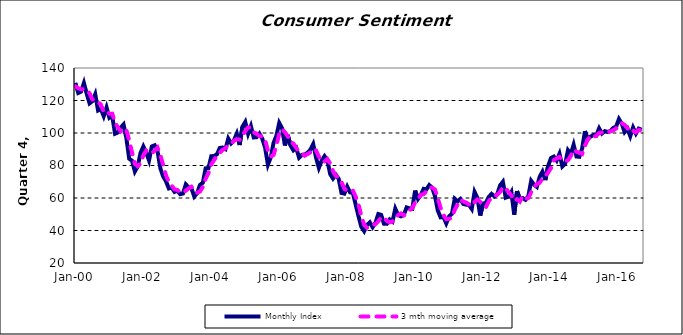
| Category | Monthly Index | 3 mth moving average |
|---|---|---|
| 2000-01-01 | 130.854 | 128.727 |
| 2000-02-01 | 124.642 | 127.553 |
| 2000-03-01 | 125.471 | 126.989 |
| 2000-04-01 | 130.785 | 126.966 |
| 2000-05-01 | 124.1 | 126.785 |
| 2000-06-01 | 118.243 | 124.376 |
| 2000-07-01 | 119.633 | 120.659 |
| 2000-08-01 | 123.854 | 120.577 |
| 2000-09-01 | 113.849 | 119.112 |
| 2000-10-01 | 114.76 | 117.487 |
| 2000-11-01 | 110.348 | 112.986 |
| 2000-12-01 | 115.74 | 113.616 |
| 2001-01-01 | 109.394 | 111.828 |
| 2001-02-01 | 110.585 | 111.907 |
| 2001-03-01 | 99.542 | 106.507 |
| 2001-04-01 | 100.32 | 103.483 |
| 2001-05-01 | 103.365 | 101.076 |
| 2001-06-01 | 105.264 | 102.983 |
| 2001-07-01 | 96.893 | 101.841 |
| 2001-08-01 | 84.156 | 95.438 |
| 2001-09-01 | 82.945 | 87.998 |
| 2001-10-01 | 76.305 | 81.135 |
| 2001-11-01 | 79.442 | 79.564 |
| 2001-12-01 | 87.701 | 81.149 |
| 2002-01-01 | 91.715 | 86.286 |
| 2002-02-01 | 87.952 | 89.123 |
| 2002-03-01 | 83.1 | 87.589 |
| 2002-04-01 | 91.732 | 87.594 |
| 2002-05-01 | 92.449 | 89.094 |
| 2002-06-01 | 88.968 | 91.05 |
| 2002-07-01 | 78.318 | 86.578 |
| 2002-08-01 | 73.284 | 80.19 |
| 2002-09-01 | 70.275 | 73.959 |
| 2002-10-01 | 65.899 | 69.819 |
| 2002-11-01 | 66.462 | 67.545 |
| 2002-12-01 | 63.754 | 65.372 |
| 2003-01-01 | 64.538 | 64.918 |
| 2003-02-01 | 62.348 | 63.547 |
| 2003-03-01 | 62.77 | 63.219 |
| 2003-04-01 | 68.406 | 64.508 |
| 2003-05-01 | 66.543 | 65.906 |
| 2003-06-01 | 65.817 | 66.922 |
| 2003-07-01 | 60.882 | 64.414 |
| 2003-08-01 | 63.048 | 63.249 |
| 2003-09-01 | 68.012 | 63.981 |
| 2003-10-01 | 69.377 | 66.812 |
| 2003-11-01 | 78.239 | 71.876 |
| 2003-12-01 | 78.337 | 75.317 |
| 2004-01-01 | 85.719 | 80.765 |
| 2004-02-01 | 85.823 | 83.293 |
| 2004-03-01 | 86.901 | 86.148 |
| 2004-04-01 | 90.768 | 87.83 |
| 2004-05-01 | 91.067 | 89.578 |
| 2004-06-01 | 90.101 | 90.645 |
| 2004-07-01 | 96.587 | 92.585 |
| 2004-08-01 | 93.595 | 93.427 |
| 2004-09-01 | 95.471 | 95.217 |
| 2004-10-01 | 99.608 | 96.224 |
| 2004-11-01 | 92.605 | 95.895 |
| 2004-12-01 | 103.858 | 98.69 |
| 2005-01-01 | 106.787 | 101.084 |
| 2005-02-01 | 99.524 | 103.39 |
| 2005-03-01 | 104.248 | 103.52 |
| 2005-04-01 | 97.268 | 100.347 |
| 2005-05-01 | 97.391 | 99.636 |
| 2005-06-01 | 99.616 | 98.092 |
| 2005-07-01 | 96.532 | 97.846 |
| 2005-08-01 | 90.996 | 95.714 |
| 2005-09-01 | 80.504 | 89.344 |
| 2005-10-01 | 84.96 | 85.487 |
| 2005-11-01 | 93.966 | 86.477 |
| 2005-12-01 | 98.245 | 92.39 |
| 2006-01-01 | 106.172 | 99.461 |
| 2006-02-01 | 102.898 | 102.438 |
| 2006-03-01 | 92.327 | 100.465 |
| 2006-04-01 | 98.827 | 98.017 |
| 2006-05-01 | 92.311 | 94.488 |
| 2006-06-01 | 89.35 | 93.496 |
| 2006-07-01 | 90.854 | 90.838 |
| 2006-08-01 | 84.831 | 88.345 |
| 2006-09-01 | 86.547 | 87.41 |
| 2006-10-01 | 86.718 | 86.032 |
| 2006-11-01 | 87.859 | 87.041 |
| 2006-12-01 | 89.761 | 88.113 |
| 2007-01-01 | 93.17 | 90.263 |
| 2007-02-01 | 84.86 | 89.264 |
| 2007-03-01 | 78.529 | 85.52 |
| 2007-04-01 | 82.999 | 82.129 |
| 2007-05-01 | 85.732 | 82.42 |
| 2007-06-01 | 83.166 | 83.966 |
| 2007-07-01 | 74.696 | 81.198 |
| 2007-08-01 | 71.97 | 76.611 |
| 2007-09-01 | 74.26 | 73.642 |
| 2007-10-01 | 71.848 | 72.693 |
| 2007-11-01 | 63.082 | 69.73 |
| 2007-12-01 | 62.686 | 65.872 |
| 2008-01-01 | 67.013 | 64.261 |
| 2008-02-01 | 63.502 | 64.4 |
| 2008-03-01 | 63.253 | 64.589 |
| 2008-04-01 | 55.965 | 60.907 |
| 2008-05-01 | 48.813 | 56.011 |
| 2008-06-01 | 42.23 | 49.003 |
| 2008-07-01 | 39.593 | 43.545 |
| 2008-08-01 | 43.372 | 41.731 |
| 2008-09-01 | 45.022 | 42.662 |
| 2008-10-01 | 42.03 | 43.474 |
| 2008-11-01 | 44.769 | 43.94 |
| 2008-12-01 | 50.15 | 45.65 |
| 2009-01-01 | 49.617 | 48.179 |
| 2009-02-01 | 44.201 | 47.99 |
| 2009-03-01 | 44.105 | 45.975 |
| 2009-04-01 | 46.773 | 45.026 |
| 2009-05-01 | 45.478 | 45.452 |
| 2009-06-01 | 53.393 | 48.548 |
| 2009-07-01 | 49.506 | 49.459 |
| 2009-08-01 | 48.726 | 50.541 |
| 2009-09-01 | 49.614 | 49.282 |
| 2009-10-01 | 54.197 | 50.845 |
| 2009-11-01 | 53.578 | 52.463 |
| 2009-12-01 | 53.334 | 53.703 |
| 2010-01-01 | 64.578 | 57.163 |
| 2010-02-01 | 59.383 | 59.098 |
| 2010-03-01 | 61.862 | 61.941 |
| 2010-04-01 | 65.63 | 62.292 |
| 2010-05-01 | 65.286 | 64.259 |
| 2010-06-01 | 67.938 | 66.285 |
| 2010-07-01 | 66.214 | 66.48 |
| 2010-08-01 | 61.426 | 65.193 |
| 2010-09-01 | 52.375 | 60.005 |
| 2010-10-01 | 48.094 | 53.965 |
| 2010-11-01 | 48.365 | 49.611 |
| 2010-12-01 | 44.373 | 46.944 |
| 2011-01-01 | 48.656 | 47.131 |
| 2011-02-01 | 50.295 | 47.775 |
| 2011-03-01 | 59.528 | 52.826 |
| 2011-04-01 | 57.858 | 55.894 |
| 2011-05-01 | 59.365 | 58.917 |
| 2011-06-01 | 56.35 | 57.857 |
| 2011-07-01 | 55.901 | 57.205 |
| 2011-08-01 | 55.829 | 56.027 |
| 2011-09-01 | 53.277 | 55.003 |
| 2011-10-01 | 63.743 | 57.616 |
| 2011-11-01 | 60.076 | 59.032 |
| 2011-12-01 | 49.206 | 57.675 |
| 2012-01-01 | 56.554 | 55.279 |
| 2012-02-01 | 57.034 | 54.265 |
| 2012-03-01 | 60.596 | 58.061 |
| 2012-04-01 | 62.531 | 60.054 |
| 2012-05-01 | 60.96 | 61.362 |
| 2012-06-01 | 62.311 | 61.934 |
| 2012-07-01 | 67.722 | 63.664 |
| 2012-08-01 | 69.97 | 66.668 |
| 2012-09-01 | 60.237 | 65.976 |
| 2012-10-01 | 60.866 | 63.691 |
| 2012-11-01 | 63.757 | 61.62 |
| 2012-12-01 | 49.754 | 58.126 |
| 2013-01-01 | 64.249 | 59.253 |
| 2013-02-01 | 59.369 | 57.791 |
| 2013-03-01 | 59.969 | 61.196 |
| 2013-04-01 | 58.875 | 59.404 |
| 2013-05-01 | 61.196 | 60.013 |
| 2013-06-01 | 70.565 | 63.545 |
| 2013-07-01 | 68.236 | 66.666 |
| 2013-08-01 | 66.818 | 68.539 |
| 2013-09-01 | 73.054 | 69.369 |
| 2013-10-01 | 76.227 | 72.033 |
| 2013-11-01 | 71.023 | 73.435 |
| 2013-12-01 | 79.777 | 75.675 |
| 2014-01-01 | 84.58 | 78.46 |
| 2014-02-01 | 85.481 | 83.279 |
| 2014-03-01 | 83.062 | 84.374 |
| 2014-04-01 | 87.226 | 85.256 |
| 2014-05-01 | 79.386 | 83.225 |
| 2014-06-01 | 81.066 | 82.559 |
| 2014-07-01 | 89.378 | 83.276 |
| 2014-08-01 | 87.115 | 85.853 |
| 2014-09-01 | 92.787 | 89.76 |
| 2014-10-01 | 85.531 | 88.477 |
| 2014-11-01 | 85.345 | 87.887 |
| 2014-12-01 | 90.456 | 87.111 |
| 2015-01-01 | 101.116 | 92.306 |
| 2015-02-01 | 96.098 | 95.89 |
| 2015-03-01 | 97.823 | 98.346 |
| 2015-04-01 | 98.737 | 97.553 |
| 2015-05-01 | 98.456 | 98.339 |
| 2015-06-01 | 102.839 | 100.011 |
| 2015-07-01 | 99.685 | 100.326 |
| 2015-08-01 | 101.136 | 101.22 |
| 2015-09-01 | 100.648 | 100.49 |
| 2015-10-01 | 101.264 | 101.016 |
| 2015-11-01 | 103.107 | 101.673 |
| 2015-12-01 | 103.929 | 102.767 |
| 2016-01-01 | 108.622 | 105.219 |
| 2016-02-01 | 105.761 | 106.104 |
| 2016-03-01 | 100.564 | 104.982 |
| 2016-04-01 | 102.713 | 103.012 |
| 2016-05-01 | 98.059 | 100.445 |
| 2016-06-01 | 103.387 | 101.386 |
| 2016-07-01 | 99.635 | 100.361 |
| 2016-08-01 | 102.694 | 101.906 |
| 2016-09-01 | 101.986 | 101.439 |